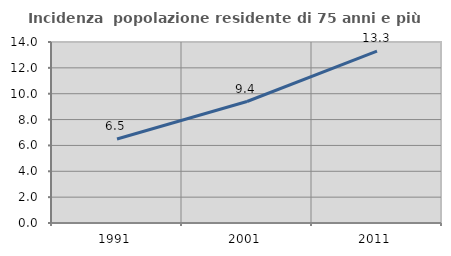
| Category | Incidenza  popolazione residente di 75 anni e più |
|---|---|
| 1991.0 | 6.502 |
| 2001.0 | 9.398 |
| 2011.0 | 13.288 |